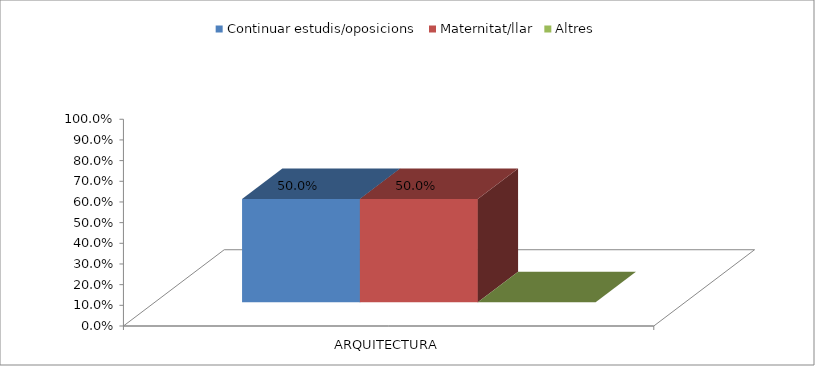
| Category | Continuar estudis/oposicions | Maternitat/llar | Altres |
|---|---|---|---|
| ARQUITECTURA | 0.5 | 0.5 | 0 |